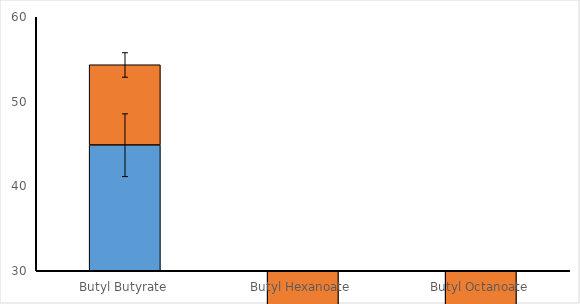
| Category | Culture Broth | Cell Pellet |
|---|---|---|
| Butyl Butyrate | 44.856 | 9.476 |
| Butyl Hexanoate | 4.159 | 6.708 |
| Butyl Octanoate | 0.297 | 0.729 |